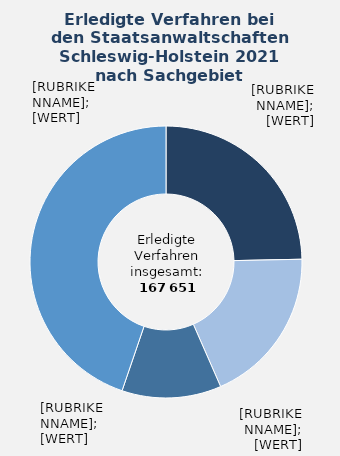
| Category | in Prozent |
|---|---|
| Sonstige allgemeine Straftaten | 0.247 |
| Betrug und Untreue | 0.187 |
| Diebstahl und Unterschlagung | 0.118 |
| Übrige Sachgebiete¹  | 0.447 |